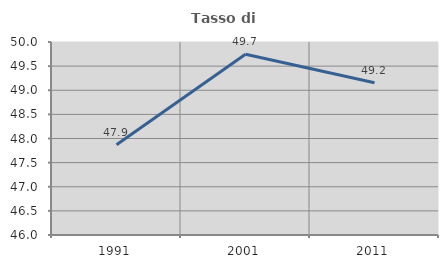
| Category | Tasso di occupazione   |
|---|---|
| 1991.0 | 47.872 |
| 2001.0 | 49.745 |
| 2011.0 | 49.155 |